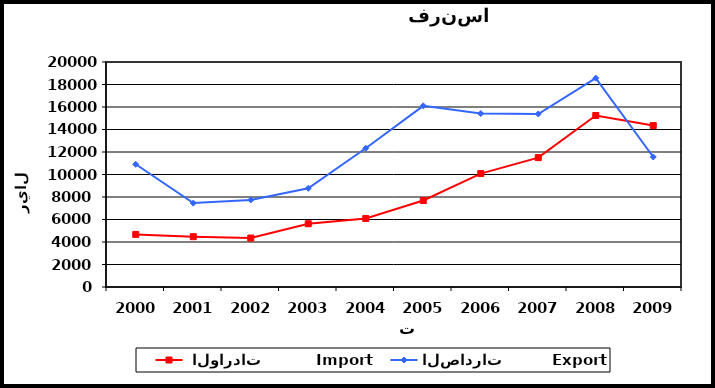
| Category |  الواردات           Import | الصادرات          Export |
|---|---|---|
| 2000.0 | 4675 | 10910 |
| 2001.0 | 4473 | 7459 |
| 2002.0 | 4350 | 7738 |
| 2003.0 | 5624 | 8774 |
| 2004.0 | 6092 | 12335 |
| 2005.0 | 7687 | 16102 |
| 2006.0 | 10082 | 15420 |
| 2007.0 | 11499 | 15380 |
| 2008.0 | 15244 | 18568 |
| 2009.0 | 14346 | 11557 |